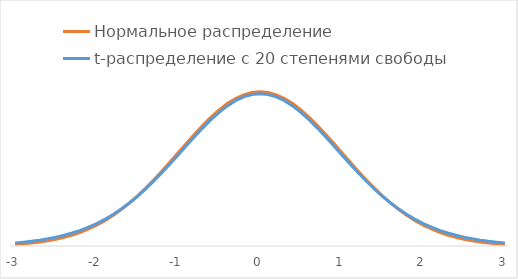
| Category | Нормальное распределение | t-распределение с 20 степенями свободы |
|---|---|---|
| -3.0 | 0.004 | 0.008 |
| -2.9 | 0.006 | 0.01 |
| -2.8 | 0.008 | 0.012 |
| -2.6999999999999997 | 0.01 | 0.015 |
| -2.5999999999999996 | 0.014 | 0.019 |
| -2.4999999999999996 | 0.018 | 0.023 |
| -2.3999999999999995 | 0.022 | 0.028 |
| -2.2999999999999994 | 0.028 | 0.034 |
| -2.1999999999999993 | 0.035 | 0.04 |
| -2.099999999999999 | 0.044 | 0.049 |
| -1.9999999999999991 | 0.054 | 0.058 |
| -1.899999999999999 | 0.066 | 0.069 |
| -1.799999999999999 | 0.079 | 0.081 |
| -1.6999999999999988 | 0.094 | 0.096 |
| -1.5999999999999988 | 0.111 | 0.111 |
| -1.4999999999999987 | 0.13 | 0.129 |
| -1.3999999999999986 | 0.15 | 0.148 |
| -1.2999999999999985 | 0.171 | 0.168 |
| -1.1999999999999984 | 0.194 | 0.19 |
| -1.0999999999999983 | 0.218 | 0.213 |
| -0.9999999999999983 | 0.242 | 0.236 |
| -0.8999999999999984 | 0.266 | 0.26 |
| -0.7999999999999984 | 0.29 | 0.283 |
| -0.6999999999999984 | 0.312 | 0.306 |
| -0.5999999999999984 | 0.333 | 0.327 |
| -0.49999999999999845 | 0.352 | 0.346 |
| -0.39999999999999847 | 0.368 | 0.362 |
| -0.2999999999999985 | 0.381 | 0.376 |
| -0.19999999999999848 | 0.391 | 0.386 |
| -0.09999999999999848 | 0.397 | 0.392 |
| 0.0 | 0.399 | 0.394 |
| 0.1 | 0.397 | 0.392 |
| 0.2 | 0.391 | 0.386 |
| 0.30000000000000004 | 0.381 | 0.376 |
| 0.4 | 0.368 | 0.362 |
| 0.5 | 0.352 | 0.346 |
| 0.6 | 0.333 | 0.327 |
| 0.7 | 0.312 | 0.306 |
| 0.7999999999999999 | 0.29 | 0.283 |
| 0.8999999999999999 | 0.266 | 0.26 |
| 0.9999999999999999 | 0.242 | 0.236 |
| 1.0999999999999999 | 0.218 | 0.213 |
| 1.2 | 0.194 | 0.19 |
| 1.3 | 0.171 | 0.168 |
| 1.4000000000000001 | 0.15 | 0.148 |
| 1.5000000000000002 | 0.13 | 0.129 |
| 1.6000000000000003 | 0.111 | 0.111 |
| 1.7000000000000004 | 0.094 | 0.096 |
| 1.8000000000000005 | 0.079 | 0.081 |
| 1.9000000000000006 | 0.066 | 0.069 |
| 2.0000000000000004 | 0.054 | 0.058 |
| 2.1000000000000005 | 0.044 | 0.049 |
| 2.2000000000000006 | 0.035 | 0.04 |
| 2.3000000000000007 | 0.028 | 0.034 |
| 2.400000000000001 | 0.022 | 0.028 |
| 2.500000000000001 | 0.018 | 0.023 |
| 2.600000000000001 | 0.014 | 0.019 |
| 2.700000000000001 | 0.01 | 0.015 |
| 2.800000000000001 | 0.008 | 0.012 |
| 2.9000000000000012 | 0.006 | 0.01 |
| 3.0000000000000013 | 0.004 | 0.008 |